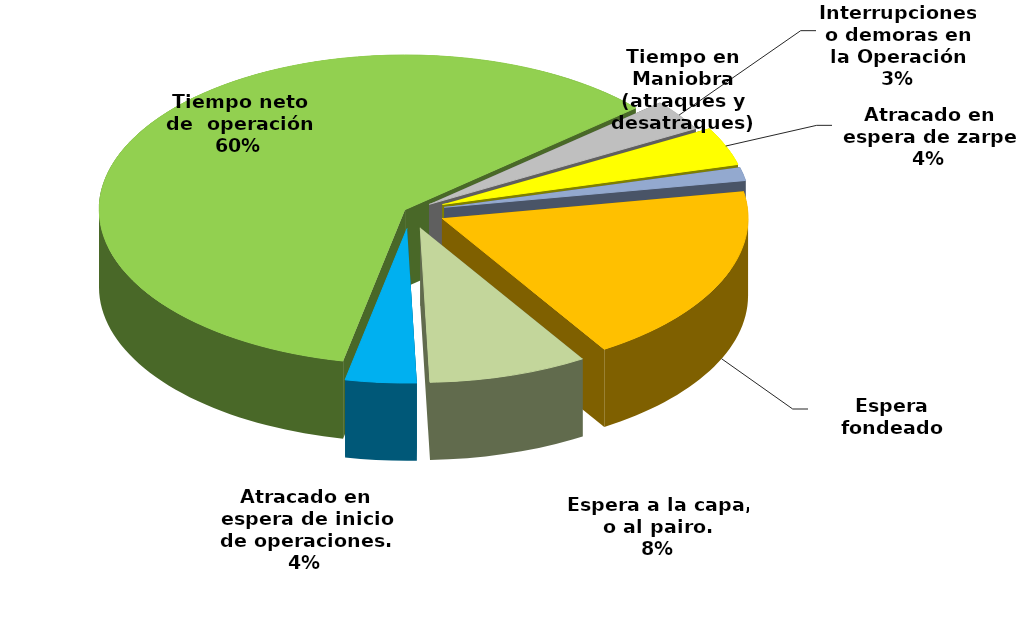
| Category | Series 0 |
|---|---|
| Espera fondeado | 15807.583 |
| Espera a la capa, o al pairo. | 7023.217 |
| Atracado en espera de inicio de operaciones. | 3141.491 |
| Tiempo neto de  operación | 50512.353 |
| Interrupciones o demoras en la Operación | 2723.43 |
| Atracado en espera de zarpe | 3341.483 |
| Tiempo en Maniobra (atraques y desatraques) | 1169.433 |